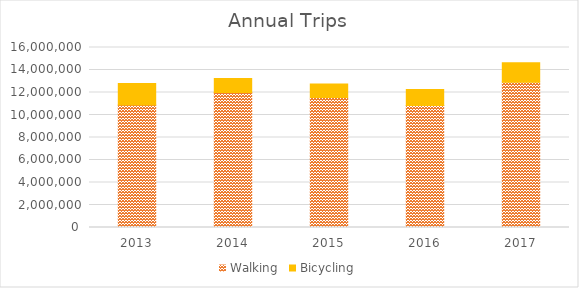
| Category | Walking | Bicycling |
|---|---|---|
| 2013 | 10894047.724 | 1907061.1 |
| 2014 | 11999527.239 | 1254774 |
| 2015 | 11564378.965 | 1194789 |
| 2016 | 10843600.985 | 1412574 |
| 2017 | 12906635.625 | 1741156 |